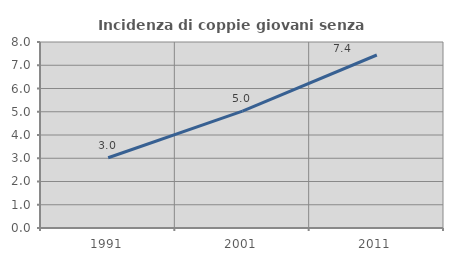
| Category | Incidenza di coppie giovani senza figli |
|---|---|
| 1991.0 | 3.02 |
| 2001.0 | 5.03 |
| 2011.0 | 7.44 |